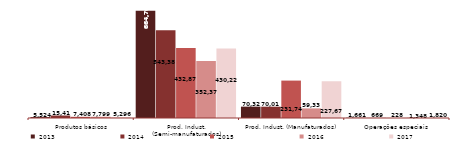
| Category | 2013 | 2014 | 2015 | 2016 | 2017 |
|---|---|---|---|---|---|
| Produtos básicos | 5524 | 15411 | 7408 | 7799 | 5295.534 |
| Prod. Indust. (Semi-manufaturados) | 664764 | 543383 | 432874 | 352376 | 430227.641 |
| Prod. Indust. (Manufaturados) | 70321 | 70011 | 231740 | 59337 | 227672.082 |
| Operações especiais | 1661 | 669 | 228 | 1348 | 1819.627 |